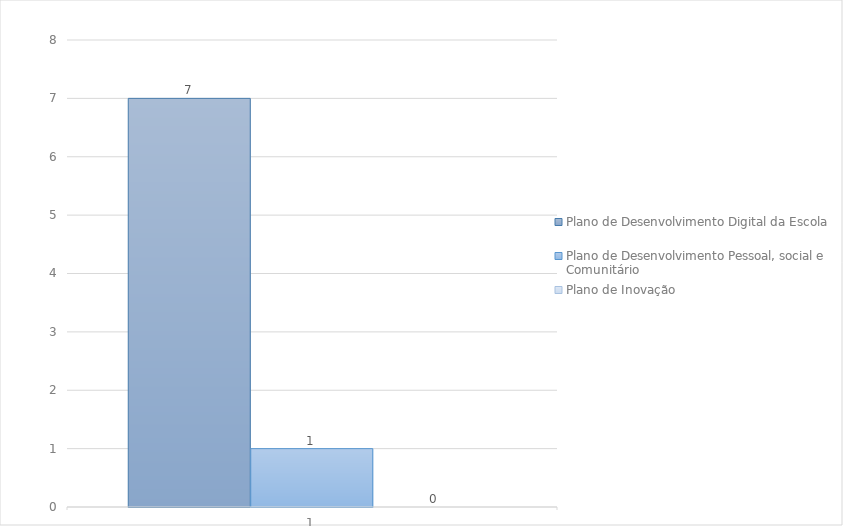
| Category | Plano de Desenvolvimento Digital da Escola | Plano de Desenvolvimento Pessoal, social e Comunitário | Plano de Inovação |
|---|---|---|---|
| 0 | 7 | 1 | 0 |